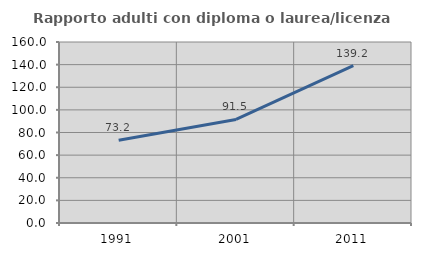
| Category | Rapporto adulti con diploma o laurea/licenza media  |
|---|---|
| 1991.0 | 73.208 |
| 2001.0 | 91.538 |
| 2011.0 | 139.2 |